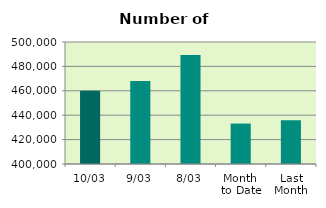
| Category | Series 0 |
|---|---|
| 10/03 | 460064 |
| 9/03 | 468080 |
| 8/03 | 489344 |
| Month 
to Date | 433139.5 |
| Last
Month | 435925.8 |